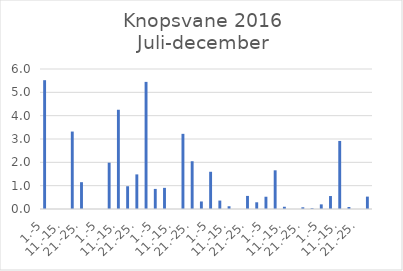
| Category | Series 0 |
|---|---|
| 1.-5 | 5.52 |
| 6.-10. | 0 |
| 11.-15. | 0 |
| 16.-20. | 3.319 |
| 21.-25. | 1.149 |
| 26.-31. | 0 |
| 1.-5 | 0 |
| 6.-10. | 1.985 |
| 11.-15. | 4.253 |
| 16.-20. | 0.975 |
| 21.-25. | 1.483 |
| 26.-31. | 5.448 |
| 1.-5 | 0.861 |
| 6.-10. | 0.906 |
| 11.-15. | 0 |
| 16.-20. | 3.221 |
| 21.-25. | 2.047 |
| 26.-30. | 0.323 |
| 1.-5 | 1.596 |
| 6.-10. | 0.361 |
| 11.-15. | 0.118 |
| 16.-20. | 0 |
| 21.-25. | 0.561 |
| 26.-31. | 0.288 |
| 1.-5 | 0.526 |
| 6.-10. | 1.658 |
| 11.-15. | 0.096 |
| 16.-20. | 0 |
| 21.-25. | 0.073 |
| 26.-30. | 0.033 |
| 1.-5 | 0.199 |
| 6.-10. | 0.556 |
| 11.-15. | 2.916 |
| 16.-20. | 0.086 |
| 21.-25. | 0 |
| 26.-31. | 0.531 |